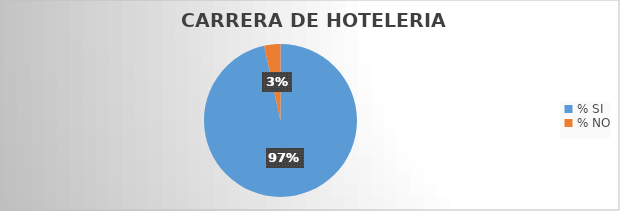
| Category | Series 0 |
|---|---|
| % SI | 96.552 |
| % NO | 3.448 |